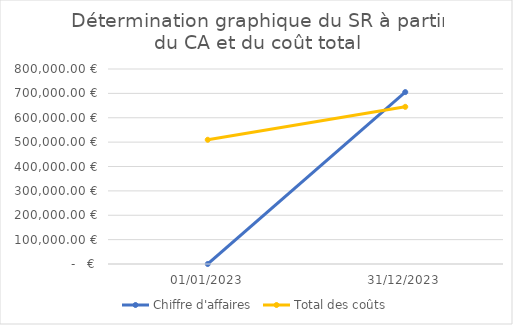
| Category | Chiffre d'affaires | Total des coûts |
|---|---|---|
| 01/01/2023 | 0 | 509627 |
| 31/12/2023 | 705250 | 644795 |